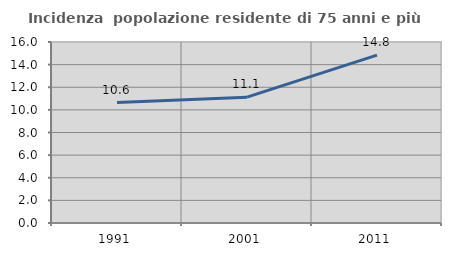
| Category | Incidenza  popolazione residente di 75 anni e più |
|---|---|
| 1991.0 | 10.65 |
| 2001.0 | 11.123 |
| 2011.0 | 14.835 |